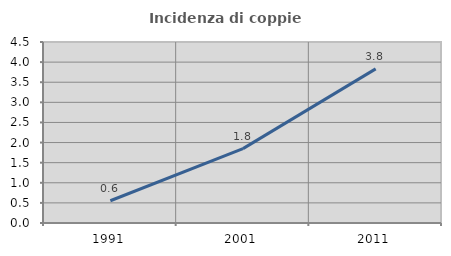
| Category | Incidenza di coppie miste |
|---|---|
| 1991.0 | 0.554 |
| 2001.0 | 1.848 |
| 2011.0 | 3.831 |